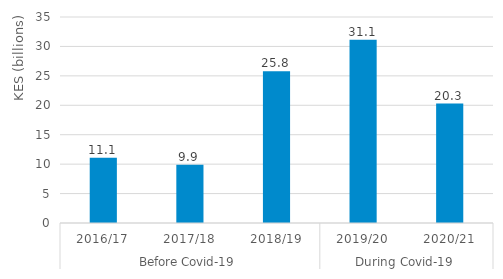
| Category | Health |
|---|---|
| 0 | 11.1 |
| 1 | 9.9 |
| 2 | 25.8 |
| 3 | 31.145 |
| 4 | 20.302 |